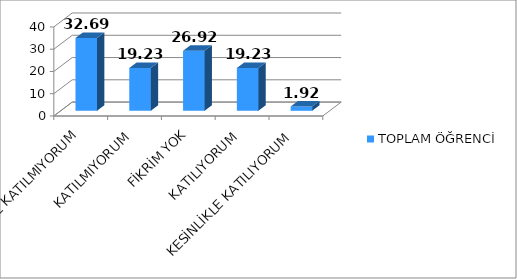
| Category | TOPLAM ÖĞRENCİ |
|---|---|
| KESİNLİKLE KATILMIYORUM | 32.69 |
| KATILMIYORUM | 19.23 |
| FİKRİM YOK | 26.92 |
| KATILIYORUM | 19.23 |
| KESİNLİKLE KATILIYORUM | 1.92 |